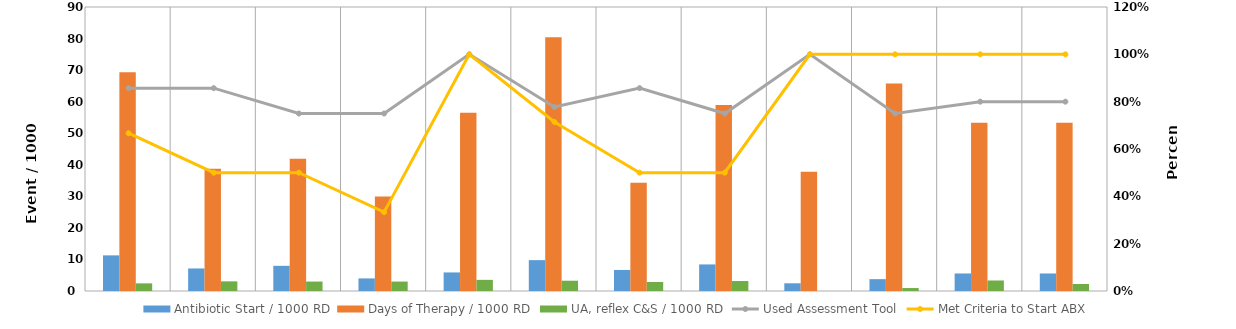
| Category | Antibiotic Start / 1000 RD | Days of Therapy / 1000 RD | UA, reflex C&S / 1000 RD |
|---|---|---|---|
| Jan | 11.29 | 69.355 | 2.419 |
| Feb | 7.143 | 38.776 | 3.061 |
| Mar | 7.976 | 41.874 | 2.991 |
| Apr | 3.988 | 29.91 | 2.991 |
| May | 5.882 | 56.471 | 3.529 |
| Jun | 9.783 | 80.435 | 3.261 |
| Jul | 6.667 | 34.286 | 2.857 |
| Aug | 8.421 | 58.947 | 3.158 |
| Sep | 2.439 | 37.805 | 0 |
| Oct | 3.756 | 65.728 | 0.939 |
| Nov | 5.556 | 53.333 | 3.333 |
| Dec | 5.556 | 53.333 | 2.222 |